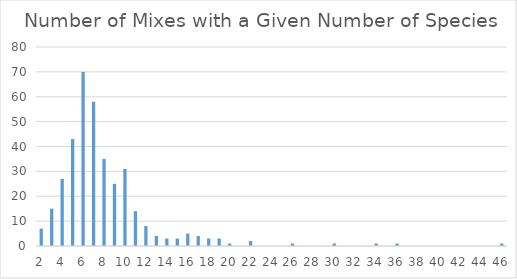
| Category | Series 0 |
|---|---|
| 2.0 | 7 |
| 3.0 | 15 |
| 4.0 | 27 |
| 5.0 | 43 |
| 6.0 | 70 |
| 7.0 | 58 |
| 8.0 | 35 |
| 9.0 | 25 |
| 10.0 | 31 |
| 11.0 | 14 |
| 12.0 | 8 |
| 13.0 | 4 |
| 14.0 | 3 |
| 15.0 | 3 |
| 16.0 | 5 |
| 17.0 | 4 |
| 18.0 | 3 |
| 19.0 | 3 |
| 20.0 | 1 |
| 21.0 | 0 |
| 22.0 | 2 |
| 23.0 | 0 |
| 24.0 | 0 |
| 25.0 | 0 |
| 26.0 | 1 |
| 27.0 | 0 |
| 28.0 | 0 |
| 29.0 | 0 |
| 30.0 | 1 |
| 31.0 | 0 |
| 32.0 | 0 |
| 33.0 | 0 |
| 34.0 | 1 |
| 35.0 | 0 |
| 36.0 | 1 |
| 37.0 | 0 |
| 38.0 | 0 |
| 39.0 | 0 |
| 40.0 | 0 |
| 41.0 | 0 |
| 42.0 | 0 |
| 43.0 | 0 |
| 44.0 | 0 |
| 45.0 | 0 |
| 46.0 | 1 |